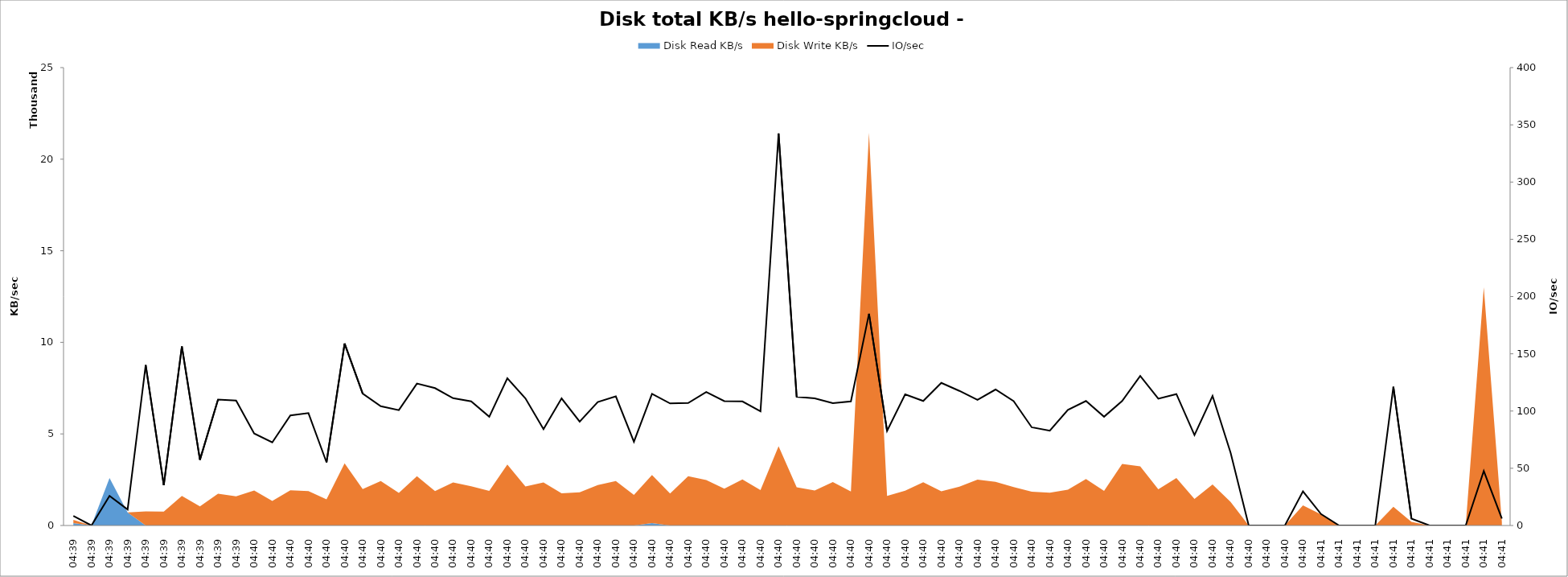
| Category | IO/sec |
|---|---|
| 0 | 8.4 |
| 00:00 | 0 |
| 00:00 | 25.8 |
| 00:00 | 14 |
| 00:00 | 140.2 |
| 00:00 | 35.2 |
| 00:00 | 156.4 |
| 00:00 | 57.4 |
| 00:00 | 110 |
| 00:00 | 109.2 |
| 00:00 | 80.4 |
| 00:00 | 72.6 |
| 00:00 | 96.2 |
| 00:00 | 98.2 |
| 00:00 | 55.2 |
| 00:00 | 159 |
| 00:00 | 115.2 |
| 00:00 | 104.2 |
| 00:00 | 100.8 |
| 00:00 | 124 |
| 00:00 | 120 |
| 00:00 | 111.2 |
| 00:00 | 108.4 |
| 00:00 | 95 |
| 00:00 | 128.6 |
| 00:00 | 111 |
| 00:00 | 84.2 |
| 00:00 | 111 |
| 00:00 | 90.8 |
| 00:00 | 107.8 |
| 00:00 | 112.8 |
| 00:00 | 73.2 |
| 00:00 | 115 |
| 00:00 | 106.6 |
| 00:00 | 107 |
| 00:00 | 116.6 |
| 00:00 | 108.6 |
| 00:00 | 108.4 |
| 00:00 | 99.8 |
| 00:00 | 342.4 |
| 00:00 | 112.4 |
| 00:00 | 111 |
| 00:00 | 106.8 |
| 00:00 | 108.4 |
| 00:00 | 185 |
| 00:00 | 82.6 |
| 00:00 | 114.6 |
| 00:00 | 108.8 |
| 00:00 | 124.6 |
| 00:00 | 117.6 |
| 00:00 | 109.8 |
| 00:00 | 118.8 |
| 00:00 | 108.6 |
| 00:00 | 85.8 |
| 00:00 | 82.8 |
| 00:00 | 101 |
| 00:00 | 108.8 |
| 00:00 | 95 |
| 00:00 | 108.8 |
| 00:00 | 130.6 |
| 00:00 | 110.8 |
| 00:00 | 114.8 |
| 00:00 | 79 |
| 00:00 | 113.2 |
| 00:00 | 63.4 |
| 00:00 | 0 |
| 00:00 | 0 |
| 00:00 | 0 |
| 00:00 | 29.8 |
| 00:00 | 10 |
| 00:00 | 0 |
| 00:00 | 0 |
| 00:00 | 0 |
| 00:00 | 121.2 |
| 00:00 | 6 |
| 00:00 | 0 |
| 00:00 | 0 |
| 00:00 | 0 |
| 00:00 | 47.6 |
| 00:00 | 6 |